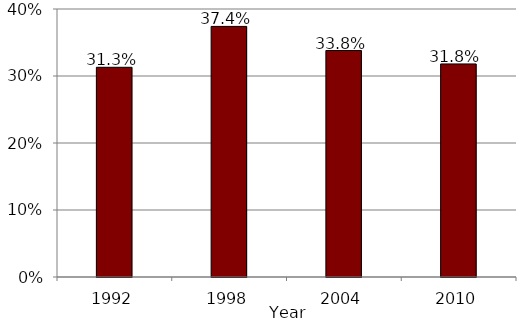
| Category | Series 0 |
|---|---|
| 1992.0 | 0.313 |
| 1998.0 | 0.374 |
| 2004.0 | 0.338 |
| 2010.0 | 0.318 |